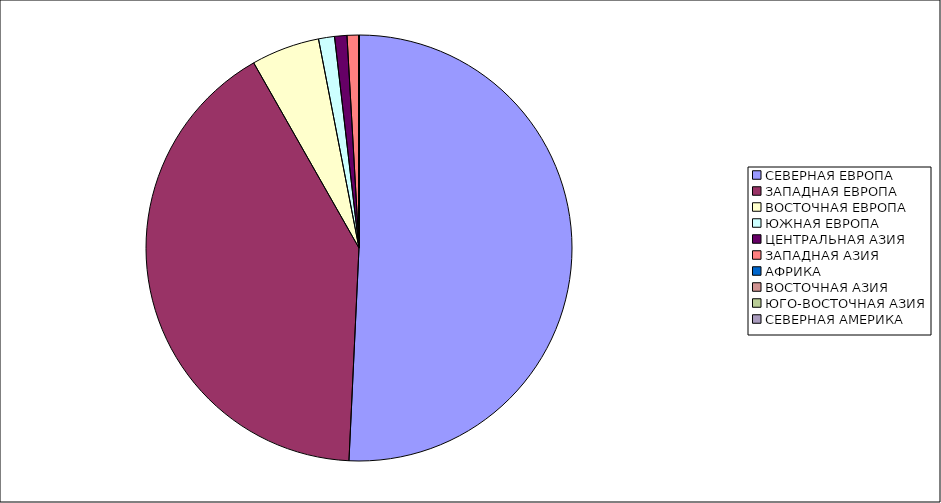
| Category | Оборот |
|---|---|
| СЕВЕРНАЯ ЕВРОПА | 50.75 |
| ЗАПАДНАЯ ЕВРОПА | 41.019 |
| ВОСТОЧНАЯ ЕВРОПА | 5.183 |
| ЮЖНАЯ ЕВРОПА | 1.211 |
| ЦЕНТРАЛЬНАЯ АЗИЯ | 0.938 |
| ЗАПАДНАЯ АЗИЯ | 0.884 |
| АФРИКА | 0.012 |
| ВОСТОЧНАЯ АЗИЯ | 0.001 |
| ЮГО-ВОСТОЧНАЯ АЗИЯ | 0.001 |
| СЕВЕРНАЯ АМЕРИКА | 0.001 |